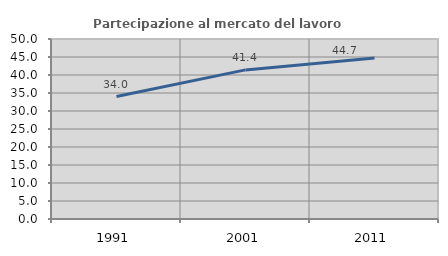
| Category | Partecipazione al mercato del lavoro  femminile |
|---|---|
| 1991.0 | 34.015 |
| 2001.0 | 41.417 |
| 2011.0 | 44.744 |